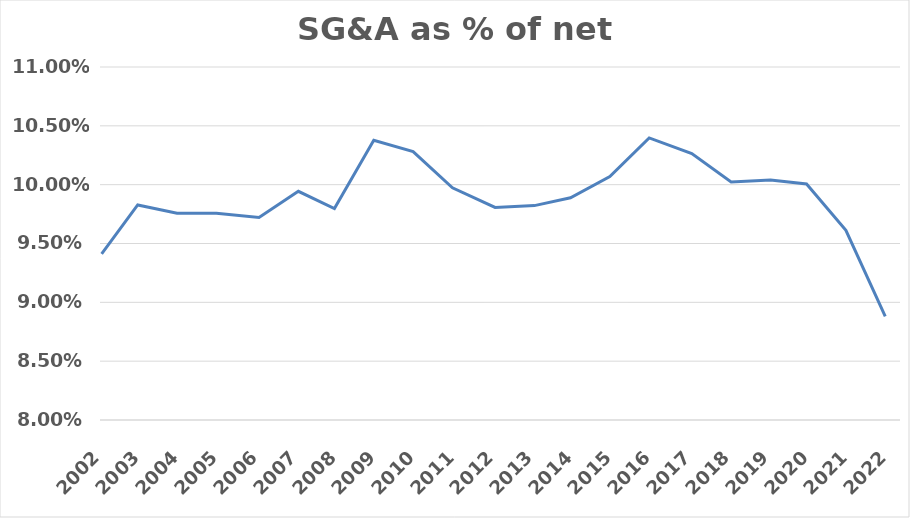
| Category | SG&A as % of net sales |
|---|---|
| 2022-08-28 | 0.089 |
| 2021-08-29 | 0.096 |
| 2020-08-30 | 0.1 |
| 2019-09-01 | 0.1 |
| 2018-09-02 | 0.1 |
| 2017-09-03 | 0.103 |
| 2016-08-28 | 0.104 |
| 2015-08-30 | 0.101 |
| 2014-08-31 | 0.099 |
| 2013-09-01 | 0.098 |
| 2012-09-02 | 0.098 |
| 2011-08-28 | 0.1 |
| 2010-08-29 | 0.103 |
| 2009-08-30 | 0.104 |
| 2008-08-31 | 0.098 |
| 2007-09-02 | 0.099 |
| 2006-09-03 | 0.097 |
| 2005-08-25 | 0.098 |
| 2004-08-29 | 0.098 |
| 2003-08-31 | 0.098 |
| 2002-09-01 | 0.094 |